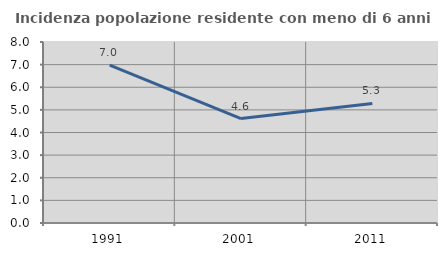
| Category | Incidenza popolazione residente con meno di 6 anni |
|---|---|
| 1991.0 | 6.975 |
| 2001.0 | 4.616 |
| 2011.0 | 5.283 |